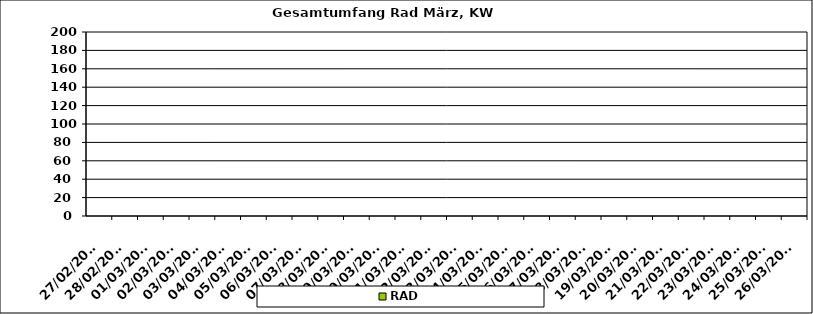
| Category | RAD |
|---|---|
| 27/02/2023 | 0 |
| 28/02/2023 | 0 |
| 01/03/2023 | 0 |
| 02/03/2023 | 0 |
| 03/03/2023 | 0 |
| 04/03/2023 | 0 |
| 05/03/2023 | 0 |
| 06/03/2023 | 0 |
| 07/03/2023 | 0 |
| 08/03/2023 | 0 |
| 09/03/2023 | 0 |
| 10/03/2023 | 0 |
| 11/03/2023 | 0 |
| 12/03/2023 | 0 |
| 13/03/2023 | 0 |
| 14/03/2023 | 0 |
| 15/03/2023 | 0 |
| 16/03/2023 | 0 |
| 17/03/2023 | 0 |
| 18/03/2023 | 0 |
| 19/03/2023 | 0 |
| 20/03/2023 | 0 |
| 21/03/2023 | 0 |
| 22/03/2023 | 0 |
| 23/03/2023 | 0 |
| 24/03/2023 | 0 |
| 25/03/2023 | 0 |
| 26/03/2023 | 0 |